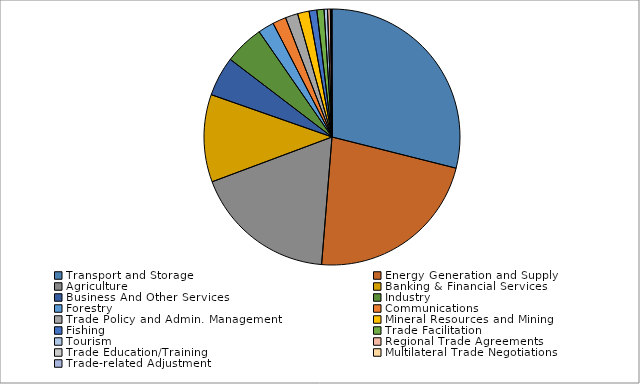
| Category | Series 0 |
|---|---|
| 0 | 0.289 |
| 1 | 0.224 |
| 2 | 0.18 |
| 3 | 0.111 |
| 4 | 0.05 |
| 5 | 0.05 |
| 6 | 0.02 |
| 7 | 0.017 |
| 8 | 0.016 |
| 9 | 0.015 |
| 10 | 0.01 |
| 11 | 0.009 |
| 12 | 0.004 |
| 13 | 0.004 |
| 14 | 0.001 |
| 15 | 0.001 |
| 16 | 0.001 |